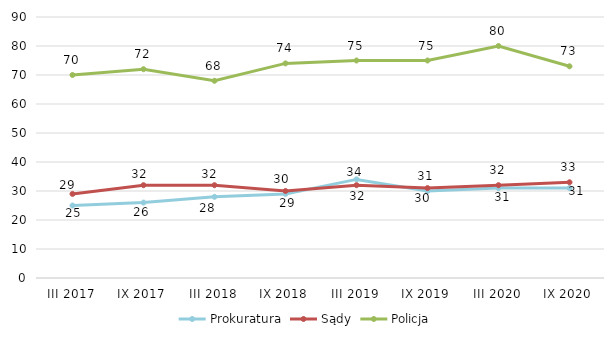
| Category | Prokuratura | Sądy | Policja |
|---|---|---|---|
| III 2017 | 25 | 29 | 70 |
| IX 2017 | 26 | 32 | 72 |
| III 2018 | 28 | 32 | 68 |
| IX 2018 | 29 | 30 | 74 |
| III 2019 | 34 | 32 | 75 |
| IX 2019 | 30 | 31 | 75 |
| III 2020 | 31 | 32 | 80 |
| IX 2020 | 31 | 33 | 73 |